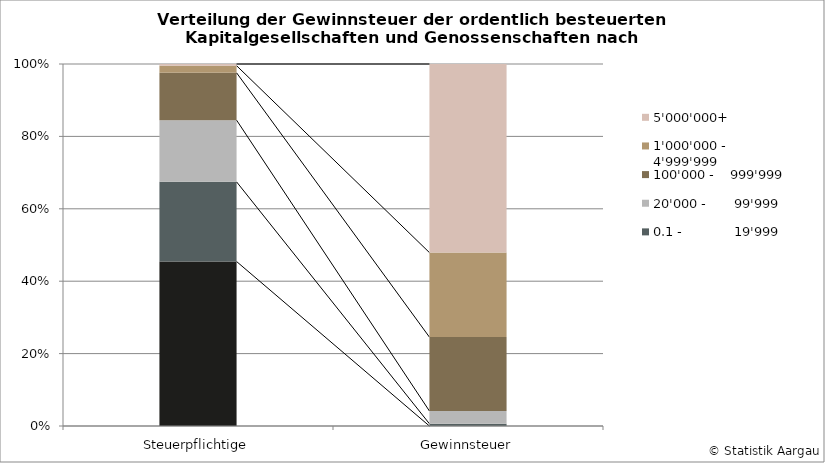
| Category | 0 | 0.1 -             19'999 | 20'000 -       99'999 | 100'000 -    999'999 | 1'000'000 - 4'999'999 | 5'000'000+ |
|---|---|---|---|---|---|---|
| Steuerpflichtige | 45.439 | 22.001 | 17.044 | 13.085 | 1.968 | 0.463 |
| Gewinnsteuer | 0 | 0.629 | 3.512 | 20.42 | 23.349 | 52.091 |